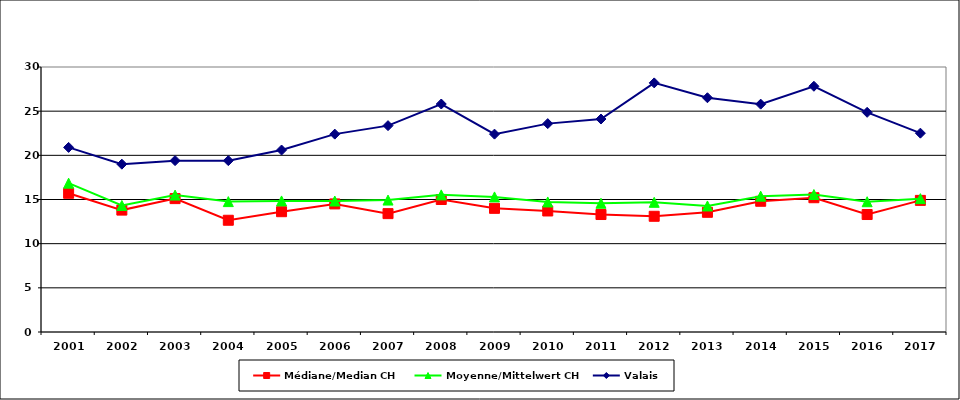
| Category | Médiane/Median CH | Moyenne/Mittelwert CH | Valais |
|---|---|---|---|
| 2001.0 | 15.7 | 16.85 | 20.9 |
| 2002.0 | 13.8 | 14.325 | 19 |
| 2003.0 | 15.1 | 15.5 | 19.4 |
| 2004.0 | 12.65 | 14.763 | 19.4 |
| 2005.0 | 13.62 | 14.838 | 20.6 |
| 2006.0 | 14.5 | 14.827 | 22.4 |
| 2007.0 | 13.4 | 14.936 | 23.36 |
| 2008.0 | 15 | 15.524 | 25.81 |
| 2009.0 | 14 | 15.293 | 22.4 |
| 2010.0 | 13.7 | 14.722 | 23.59 |
| 2011.0 | 13.3 | 14.574 | 24.11 |
| 2012.0 | 13.1 | 14.682 | 28.2 |
| 2013.0 | 13.55 | 14.269 | 26.52 |
| 2014.0 | 14.8 | 15.38 | 25.795 |
| 2015.0 | 15.2 | 15.563 | 27.82 |
| 2016.0 | 13.3 | 14.746 | 24.87 |
| 2017.0 | 14.9 | 15.097 | 22.51 |